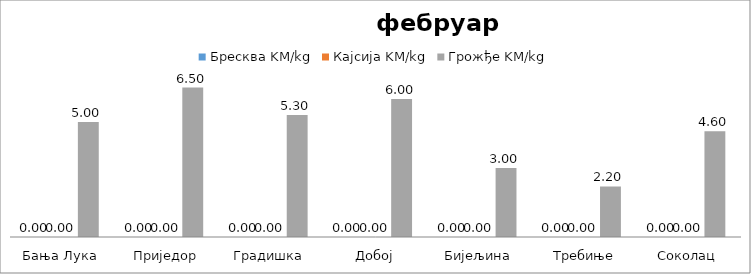
| Category | Бресква KM/kg | Кајсија KM/kg | Грожђе KM/kg |
|---|---|---|---|
| Бања Лука | 0 | 0 | 5 |
| Приједор | 0 | 0 | 6.5 |
| Градишка | 0 | 0 | 5.3 |
| Добој | 0 | 0 | 6 |
| Бијељина | 0 | 0 | 3 |
|  Требиње | 0 | 0 | 2.2 |
| Соколац | 0 | 0 | 4.6 |